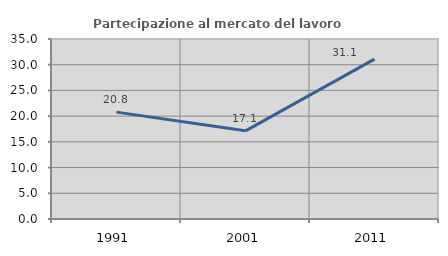
| Category | Partecipazione al mercato del lavoro  femminile |
|---|---|
| 1991.0 | 20.783 |
| 2001.0 | 17.143 |
| 2011.0 | 31.09 |